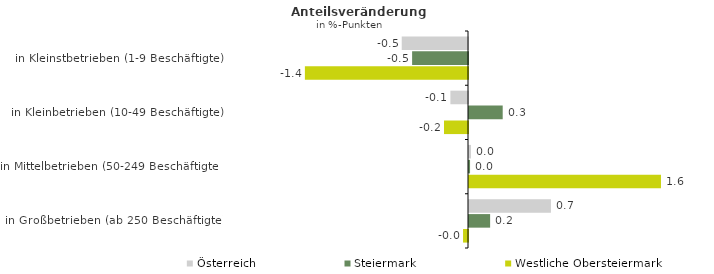
| Category | Österreich | Steiermark | Westliche Obersteiermark |
|---|---|---|---|
| in Kleinstbetrieben (1-9 Beschäftigte) | -0.55 | -0.464 | -1.354 |
| in Kleinbetrieben (10-49 Beschäftigte) | -0.146 | 0.28 | -0.199 |
| in Mittelbetrieben (50-249 Beschäftigte) | 0.016 | 0.009 | 1.593 |
| in Großbetrieben (ab 250 Beschäftigte) | 0.68 | 0.175 | -0.041 |